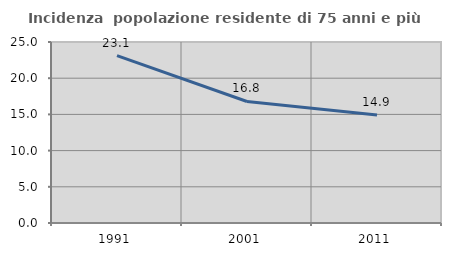
| Category | Incidenza  popolazione residente di 75 anni e più |
|---|---|
| 1991.0 | 23.117 |
| 2001.0 | 16.787 |
| 2011.0 | 14.925 |